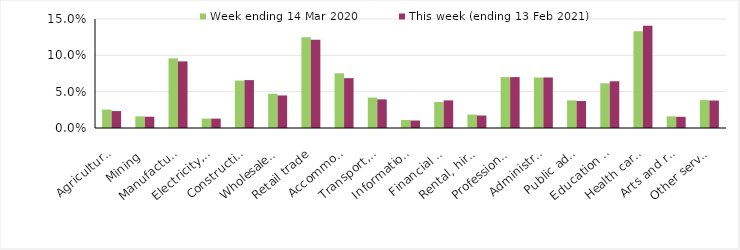
| Category | Week ending 14 Mar 2020 | This week (ending 13 Feb 2021) |
|---|---|---|
| Agriculture, forestry and fishing | 0.025 | 0.023 |
| Mining | 0.016 | 0.016 |
| Manufacturing | 0.096 | 0.092 |
| Electricity, gas, water and waste services | 0.013 | 0.013 |
| Construction | 0.065 | 0.066 |
| Wholesale trade | 0.047 | 0.045 |
| Retail trade | 0.125 | 0.121 |
| Accommodation and food services | 0.075 | 0.069 |
| Transport, postal and warehousing | 0.042 | 0.039 |
| Information media and telecommunications | 0.011 | 0.01 |
| Financial and insurance services | 0.036 | 0.038 |
| Rental, hiring and real estate services | 0.018 | 0.017 |
| Professional, scientific and technical services | 0.07 | 0.07 |
| Administrative and support services | 0.07 | 0.07 |
| Public administration and safety | 0.038 | 0.037 |
| Education and training | 0.062 | 0.064 |
| Health care and social assistance | 0.133 | 0.141 |
| Arts and recreation services | 0.016 | 0.015 |
| Other services | 0.038 | 0.038 |